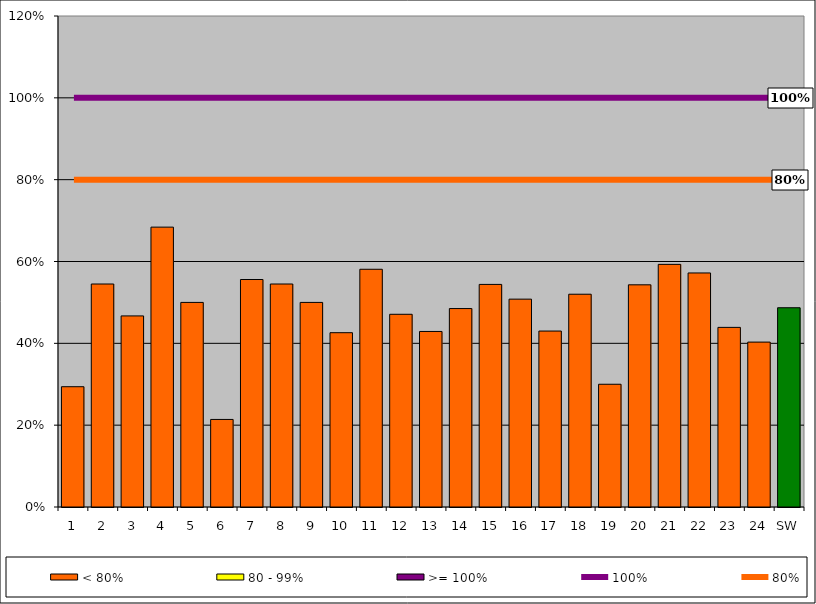
| Category | < 80% | 80 - 99% | >= 100% |
|---|---|---|---|
| 1 | 0.294 | 0 | 0 |
| 2 | 0.545 | 0 | 0 |
| 3 | 0.467 | 0 | 0 |
| 4 | 0.684 | 0 | 0 |
| 5 | 0.5 | 0 | 0 |
| 6 | 0.214 | 0 | 0 |
| 7 | 0.556 | 0 | 0 |
| 8 | 0.545 | 0 | 0 |
| 9 | 0.5 | 0 | 0 |
| 10 | 0.426 | 0 | 0 |
| 11 | 0.581 | 0 | 0 |
| 12 | 0.471 | 0 | 0 |
| 13 | 0.429 | 0 | 0 |
| 14 | 0.485 | 0 | 0 |
| 15 | 0.544 | 0 | 0 |
| 16 | 0.508 | 0 | 0 |
| 17 | 0.43 | 0 | 0 |
| 18 | 0.52 | 0 | 0 |
| 19 | 0.3 | 0 | 0 |
| 20 | 0.543 | 0 | 0 |
| 21 | 0.593 | 0 | 0 |
| 22 | 0.572 | 0 | 0 |
| 23 | 0.439 | 0 | 0 |
| 24 | 0.403 | 0 | 0 |
| SW | 0.487 | 0 | 0 |